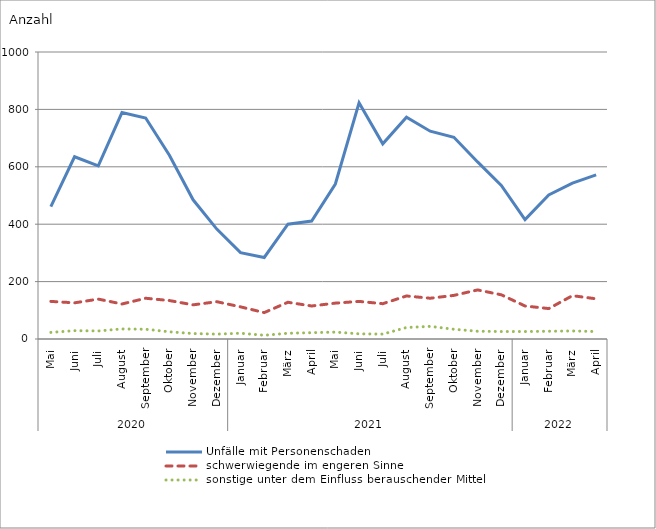
| Category | Unfälle mit Personenschaden | schwerwiegende im engeren Sinne | sonstige unter dem Einfluss berauschender Mittel |
|---|---|---|---|
| 0 | 461 | 131 | 23 |
| 1 | 635 | 126 | 29 |
| 2 | 603 | 139 | 28 |
| 3 | 789 | 122 | 35 |
| 4 | 770 | 142 | 34 |
| 5 | 640 | 134 | 25 |
| 6 | 485 | 119 | 19 |
| 7 | 383 | 130 | 17 |
| 8 | 301 | 112 | 20 |
| 9 | 284 | 92 | 13 |
| 10 | 400 | 128 | 20 |
| 11 | 411 | 115 | 22 |
| 12 | 540 | 125 | 24 |
| 13 | 823 | 131 | 18 |
| 14 | 680 | 123 | 17 |
| 15 | 773 | 150 | 40 |
| 16 | 724 | 142 | 44 |
| 17 | 703 | 152 | 34 |
| 18 | 617 | 171 | 27 |
| 19 | 535 | 154 | 26 |
| 20 | 416 | 115 | 26 |
| 21 | 502 | 106 | 27 |
| 22 | 543 | 151 | 28 |
| 23 | 572 | 140 | 26 |